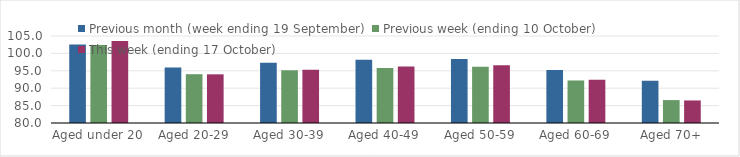
| Category | Previous month (week ending 19 September) | Previous week (ending 10 October) | This week (ending 17 October) |
|---|---|---|---|
| Aged under 20 | 102.55 | 102.41 | 103.58 |
| Aged 20-29 | 95.98 | 94.02 | 93.99 |
| Aged 30-39 | 97.28 | 95.19 | 95.27 |
| Aged 40-49 | 98.17 | 95.81 | 96.25 |
| Aged 50-59 | 98.38 | 96.15 | 96.6 |
| Aged 60-69 | 95.25 | 92.22 | 92.43 |
| Aged 70+ | 92.14 | 86.59 | 86.48 |